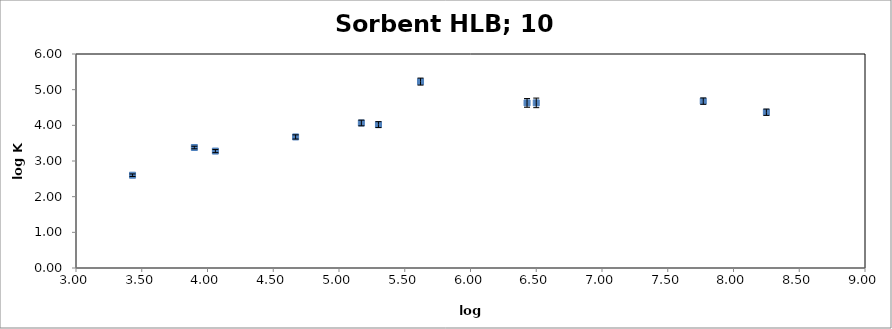
| Category | log Kow |
|---|---|
| 3.43 | 2.601 |
| 4.06 | 3.278 |
| 4.67 | 3.675 |
| 5.3 | 4.02 |
| 6.5 | 4.63 |
| 7.77 | 4.678 |
| 8.25 | 4.367 |
| 3.9 | 3.378 |
| 5.17 | 4.066 |
| 6.43 | 4.629 |
| 5.62 | 5.227 |